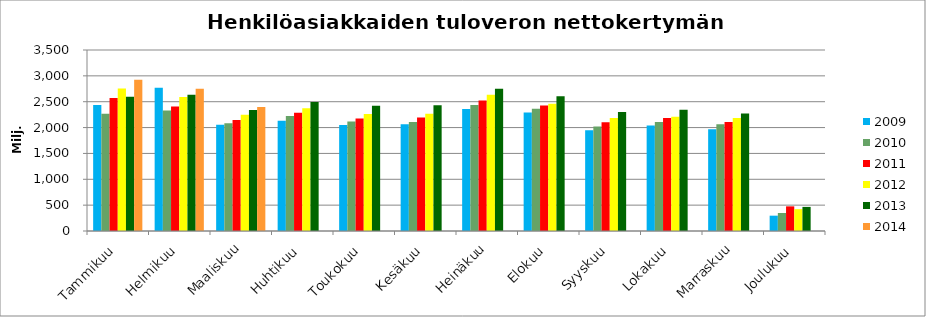
| Category | 2009 | 2010 | 2011 | 2012 | 2013 | 2014 |
|---|---|---|---|---|---|---|
| Tammikuu | 2438.489 | 2267.873 | 2569.442 | 2754.468 | 2597.268 | 2923.115 |
| Helmikuu | 2771.607 | 2330.409 | 2406.04 | 2591.616 | 2636.607 | 2751.009 |
| Maaliskuu | 2054.852 | 2084.249 | 2145.291 | 2250.057 | 2340.316 | 2399.333 |
| Huhtikuu | 2131.066 | 2225.487 | 2285.914 | 2375.631 | 2492.368 | 0 |
| Toukokuu | 2051.558 | 2117.095 | 2177.688 | 2264.689 | 2423.516 | 0 |
| Kesäkuu | 2063.182 | 2109.339 | 2194.481 | 2268.001 | 2432.777 | 0 |
| Heinäkuu | 2357.008 | 2435.026 | 2524.383 | 2633.57 | 2750.145 | 0 |
| Elokuu | 2289.863 | 2364.596 | 2427.052 | 2461.949 | 2607.529 | 0 |
| Syyskuu | 1946.167 | 2019.118 | 2102.001 | 2184.152 | 2299.363 | 0 |
| Lokakuu | 2041.676 | 2107.95 | 2185.045 | 2211.144 | 2342.648 | 0 |
| Marraskuu | 1967.798 | 2063.457 | 2106.752 | 2183.43 | 2270.307 | 0 |
| Joulukuu | 296.354 | 347.927 | 476.484 | 421.857 | 466.039 | 0 |